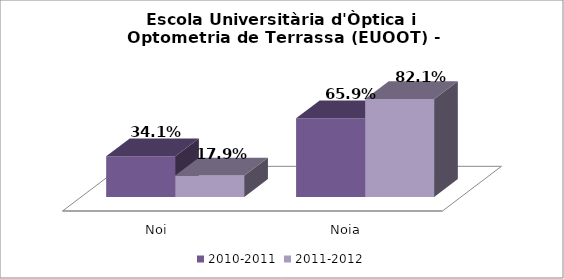
| Category | 2010-2011 | 2011-2012 |
|---|---|---|
| Noi | 0.341 | 0.179 |
| Noia | 0.659 | 0.821 |